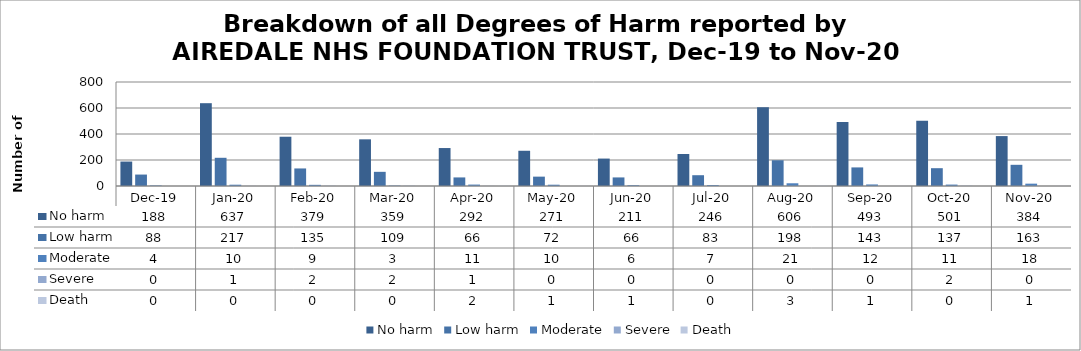
| Category | No harm | Low harm | Moderate | Severe | Death |
|---|---|---|---|---|---|
| Dec-19 | 188 | 88 | 4 | 0 | 0 |
| Jan-20 | 637 | 217 | 10 | 1 | 0 |
| Feb-20 | 379 | 135 | 9 | 2 | 0 |
| Mar-20 | 359 | 109 | 3 | 2 | 0 |
| Apr-20 | 292 | 66 | 11 | 1 | 2 |
| May-20 | 271 | 72 | 10 | 0 | 1 |
| Jun-20 | 211 | 66 | 6 | 0 | 1 |
| Jul-20 | 246 | 83 | 7 | 0 | 0 |
| Aug-20 | 606 | 198 | 21 | 0 | 3 |
| Sep-20 | 493 | 143 | 12 | 0 | 1 |
| Oct-20 | 501 | 137 | 11 | 2 | 0 |
| Nov-20 | 384 | 163 | 18 | 0 | 1 |